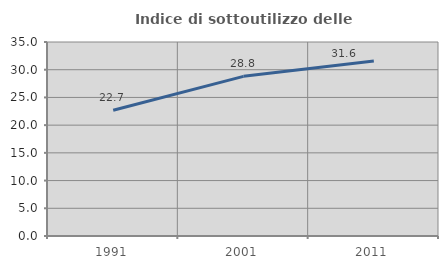
| Category | Indice di sottoutilizzo delle abitazioni  |
|---|---|
| 1991.0 | 22.68 |
| 2001.0 | 28.804 |
| 2011.0 | 31.591 |